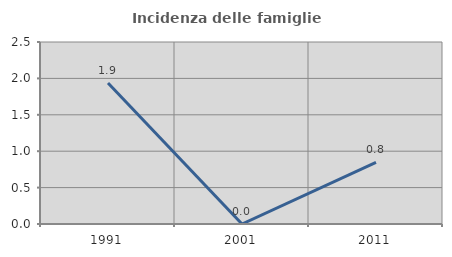
| Category | Incidenza delle famiglie numerose |
|---|---|
| 1991.0 | 1.938 |
| 2001.0 | 0 |
| 2011.0 | 0.847 |